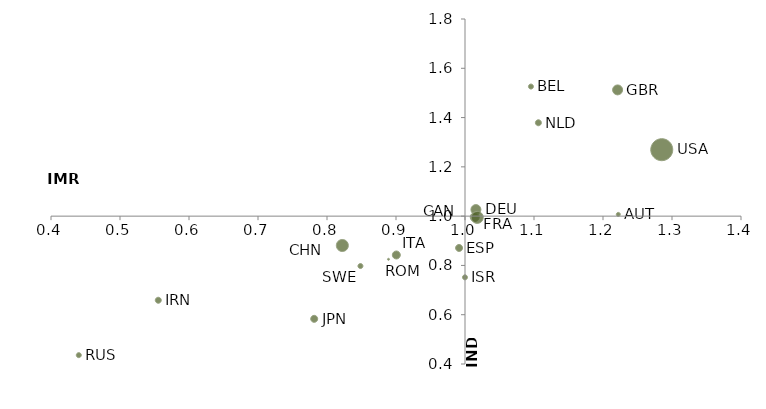
| Category | IMR |
|---|---|
| 1.0152524361945896 | 1.028 |
| 1.2216610576030982 | 1.008 |
| 1.0953122283437131 | 1.527 |
| 1.0137324353263584 | 0.997 |
| 0.8219791206197342 | 0.882 |
| 0.9911256205433273 | 0.872 |
| 1.2847897612064596 | 1.271 |
| 1.0171375901278383 | 0.997 |
| 0.5547588089787071 | 0.661 |
| 0.9993462579701412 | 0.753 |
| 0.9003826481216525 | 0.843 |
| 0.7811735173795157 | 0.584 |
| 1.1060758777049569 | 1.38 |
| 0.8889995926007684 | 0.825 |
| 1.2209542330423497 | 1.513 |
| 0.43988094368174124 | 0.437 |
| 0.8479765113603018 | 0.799 |